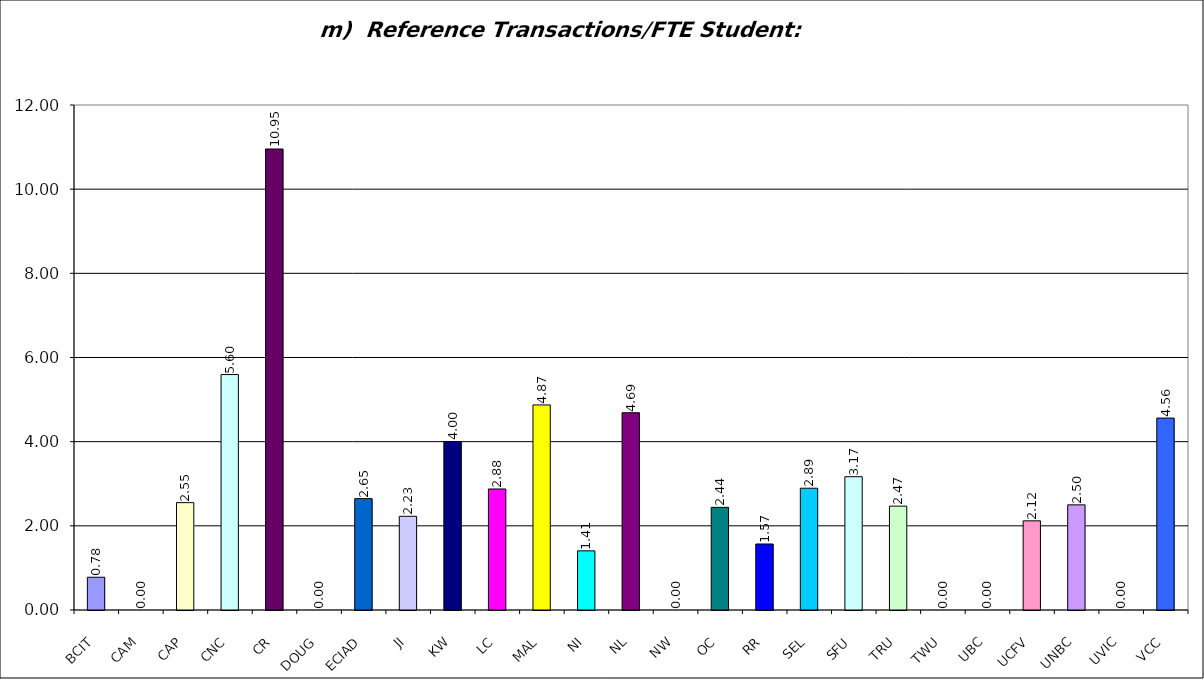
| Category | m)  Reference Transactions/FTE Student:  6(a)/3(a) |
|---|---|
| BCIT | 0.778 |
| CAM | 0 |
| CAP | 2.551 |
| CNC | 5.595 |
| CR | 10.954 |
| DOUG | 0 |
| ECIAD | 2.646 |
| JI | 2.227 |
| KW | 4.005 |
| LC | 2.876 |
| MAL | 4.873 |
| NI | 1.406 |
| NL | 4.688 |
| NW | 0 |
| OC | 2.44 |
| RR | 1.568 |
| SEL | 2.894 |
| SFU | 3.168 |
| TRU | 2.468 |
| TWU | 0 |
| UBC | 0 |
| UCFV | 2.119 |
| UNBC | 2.498 |
| UVIC | 0 |
| VCC | 4.561 |